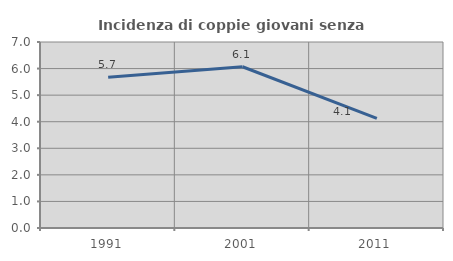
| Category | Incidenza di coppie giovani senza figli |
|---|---|
| 1991.0 | 5.672 |
| 2001.0 | 6.069 |
| 2011.0 | 4.127 |